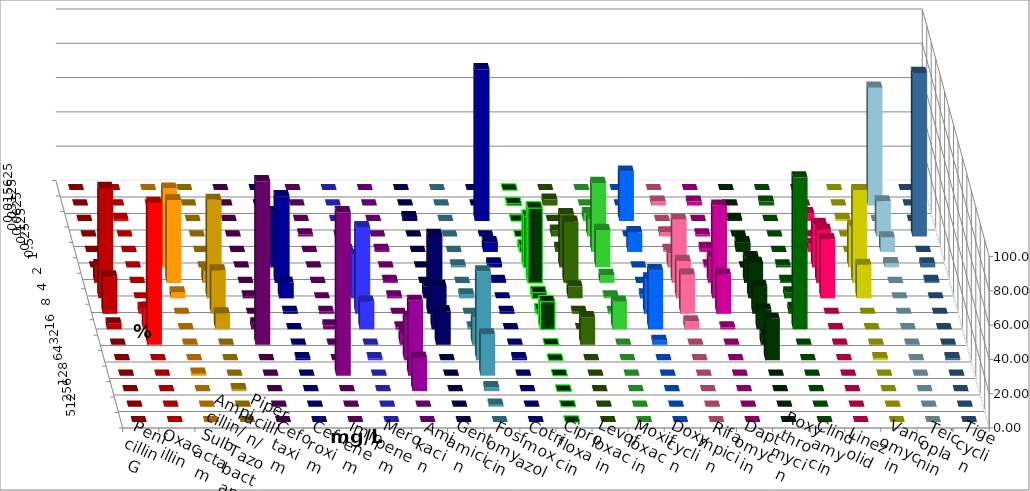
| Category | Penicillin G | Oxacillin | Ampicillin/ Sulbactam | Piperacillin/ Tazobactam | Cefotaxim | Cefuroxim | Imipenem | Meropenem | Amikacin | Gentamicin | Fosfomycin | Cotrimoxazol | Ciprofloxacin | Levofloxacin | Moxifloxacin | Doxycyclin | Rifampicin | Daptomycin | Roxythromycin | Clindamycin | Linezolid | Vancomycin | Teicoplanin | Tigecyclin |
|---|---|---|---|---|---|---|---|---|---|---|---|---|---|---|---|---|---|---|---|---|---|---|---|---|
| 0.015625 | 0 | 0 | 0 | 0 | 0 | 0 | 0 | 0 | 0 | 0 | 0 | 0 | 0 | 0 | 0 | 0 | 0 | 0 | 0 | 0 | 0 | 0 | 0 | 0 |
| 0.03125 | 0 | 0 | 0 | 0 | 0 | 0 | 0 | 0 | 0 | 0 | 0 | 0 | 1.149 | 3.448 | 0 | 0 | 2.299 | 2.299 | 0 | 2.299 | 0 | 0 | 0 | 68.675 |
| 0.0625 | 0 | 1.149 | 0 | 0 | 0 | 0 | 2.299 | 0 | 0 | 2.299 | 0 | 88.506 | 0 | 0 | 4.598 | 28.736 | 0 | 0 | 1.149 | 0 | 4.598 | 1.149 | 0 | 0 |
| 0.125 | 0 | 0 | 1.149 | 0 | 0 | 1.149 | 0 | 0 | 0 | 0 | 0 | 0 | 0 | 3.448 | 10.345 | 0 | 2.299 | 1.149 | 0 | 0 | 0 | 0 | 95.402 | 20.482 |
| 0.25 | 0 | 0 | 0 | 0 | 0 | 0 | 3.448 | 1.149 | 1.149 | 0 | 0 | 5.747 | 3.448 | 2.299 | 40.23 | 11.494 | 1.149 | 2.299 | 5.747 | 0 | 4.598 | 0 | 0 | 8.434 |
| 0.5 | 0 | 0 | 45.977 | 0 | 0 | 0 | 32.184 | 3.448 | 0 | 0 | 1.149 | 2.299 | 29.885 | 31.034 | 21.839 | 0 | 8.046 | 1.149 | 0 | 1.149 | 25.287 | 24.138 | 2.299 | 2.41 |
| 1.0 | 10.345 | 0 | 48.276 | 6.897 | 0 | 0 | 50.575 | 2.299 | 1.149 | 0 | 0 | 1.149 | 43.678 | 35.632 | 4.598 | 0 | 36.782 | 14.943 | 14.943 | 1.149 | 31.034 | 54.023 | 1.149 | 0 |
| 2.0 | 64.368 | 0 | 3.448 | 57.471 | 1.149 | 0 | 9.195 | 25.287 | 1.149 | 6.897 | 2.299 | 0 | 3.448 | 6.897 | 1.149 | 2.299 | 21.839 | 54.023 | 20.69 | 3.448 | 34.483 | 19.54 | 0 | 0 |
| 4.0 | 21.839 | 3.448 | 0 | 25.287 | 0 | 1.149 | 1.149 | 50.575 | 0 | 45.977 | 0 | 1.149 | 2.299 | 1.149 | 1.149 | 20.69 | 22.989 | 22.989 | 16.092 | 3.448 | 0 | 0 | 0 | 0 |
| 8.0 | 3.448 | 12.644 | 0 | 9.195 | 3.448 | 2.299 | 0 | 16.092 | 1.149 | 25.287 | 1.149 | 0 | 16.092 | 0 | 16.092 | 34.483 | 4.598 | 1.149 | 11.494 | 88.506 | 0 | 0 | 0 | 0 |
| 16.0 | 0 | 82.759 | 0 | 0 | 95.402 | 0 | 0 | 0 | 6.897 | 19.54 | 16.092 | 0 | 0 | 16.092 | 0 | 2.299 | 0 | 0 | 5.747 | 0 | 0 | 0 | 0 | 0 |
| 32.0 | 0 | 0 | 0 | 0 | 0 | 0 | 1.149 | 1.149 | 25.287 | 0 | 51.724 | 1.149 | 0 | 0 | 0 | 0 | 0 | 0 | 24.138 | 0 | 0 | 1.149 | 1.149 | 0 |
| 64.0 | 0 | 0 | 1.149 | 0 | 0 | 95.402 | 0 | 0 | 43.678 | 0 | 24.138 | 0 | 0 | 0 | 0 | 0 | 0 | 0 | 0 | 0 | 0 | 0 | 0 | 0 |
| 128.0 | 0 | 0 | 0 | 1.149 | 0 | 0 | 0 | 0 | 19.54 | 0 | 2.299 | 0 | 0 | 0 | 0 | 0 | 0 | 0 | 0 | 0 | 0 | 0 | 0 | 0 |
| 256.0 | 0 | 0 | 0 | 0 | 0 | 0 | 0 | 0 | 0 | 0 | 1.149 | 0 | 0 | 0 | 0 | 0 | 0 | 0 | 0 | 0 | 0 | 0 | 0 | 0 |
| 512.0 | 0 | 0 | 0 | 0 | 0 | 0 | 0 | 0 | 0 | 0 | 0 | 0 | 0 | 0 | 0 | 0 | 0 | 0 | 0 | 0 | 0 | 0 | 0 | 0 |